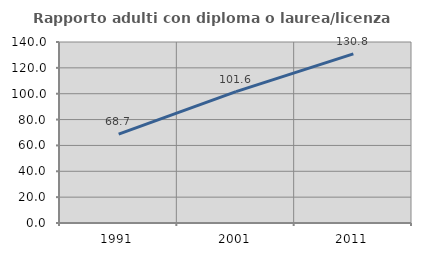
| Category | Rapporto adulti con diploma o laurea/licenza media  |
|---|---|
| 1991.0 | 68.705 |
| 2001.0 | 101.626 |
| 2011.0 | 130.847 |